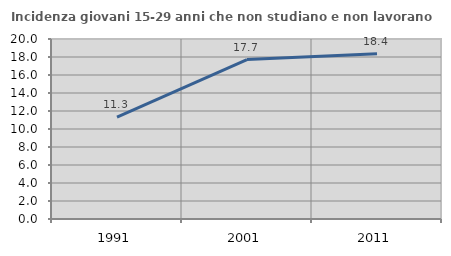
| Category | Incidenza giovani 15-29 anni che non studiano e non lavorano  |
|---|---|
| 1991.0 | 11.321 |
| 2001.0 | 17.714 |
| 2011.0 | 18.367 |